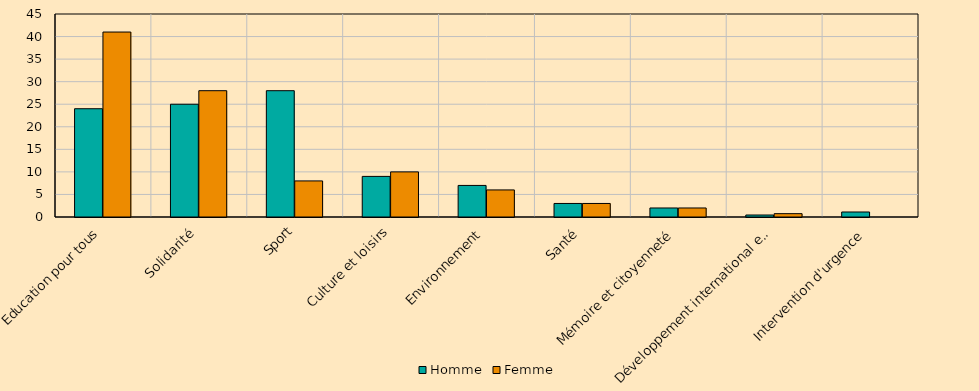
| Category | Homme | Femme |
|---|---|---|
| Education pour tous | 24 | 41 |
| Solidarité | 25 | 28 |
| Sport | 28 | 8 |
| Culture et loisirs | 9 | 10 |
| Environnement | 7 | 6 |
| Santé | 3 | 3 |
| Mémoire et citoyenneté | 2 | 2 |
| Développement international et action humanitaire | 0.44 | 0.74 |
| Intervention d'urgence | 1.11 | 0 |